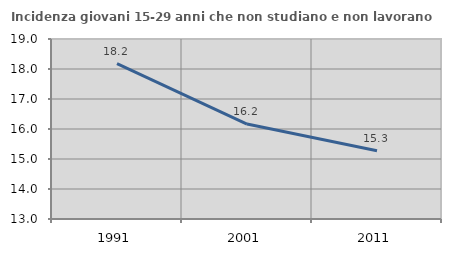
| Category | Incidenza giovani 15-29 anni che non studiano e non lavorano  |
|---|---|
| 1991.0 | 18.182 |
| 2001.0 | 16.164 |
| 2011.0 | 15.278 |